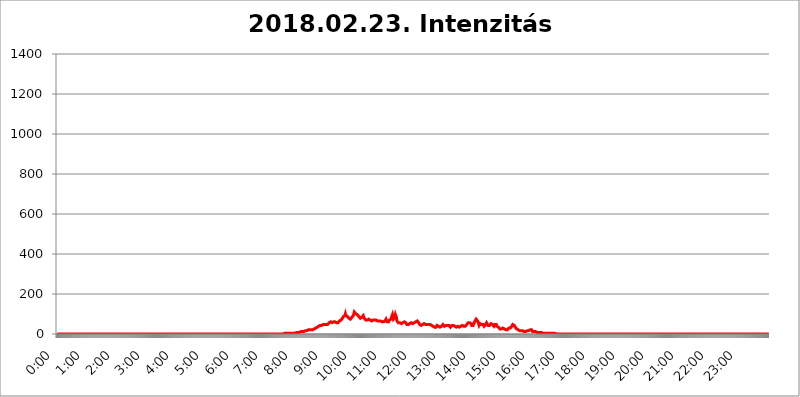
| Category | 2018.02.23. Intenzitás [W/m^2] |
|---|---|
| 0.0 | 0 |
| 0.0006944444444444445 | 0 |
| 0.001388888888888889 | 0 |
| 0.0020833333333333333 | 0 |
| 0.002777777777777778 | 0 |
| 0.003472222222222222 | 0 |
| 0.004166666666666667 | 0 |
| 0.004861111111111111 | 0 |
| 0.005555555555555556 | 0 |
| 0.0062499999999999995 | 0 |
| 0.006944444444444444 | 0 |
| 0.007638888888888889 | 0 |
| 0.008333333333333333 | 0 |
| 0.009027777777777779 | 0 |
| 0.009722222222222222 | 0 |
| 0.010416666666666666 | 0 |
| 0.011111111111111112 | 0 |
| 0.011805555555555555 | 0 |
| 0.012499999999999999 | 0 |
| 0.013194444444444444 | 0 |
| 0.013888888888888888 | 0 |
| 0.014583333333333332 | 0 |
| 0.015277777777777777 | 0 |
| 0.015972222222222224 | 0 |
| 0.016666666666666666 | 0 |
| 0.017361111111111112 | 0 |
| 0.018055555555555557 | 0 |
| 0.01875 | 0 |
| 0.019444444444444445 | 0 |
| 0.02013888888888889 | 0 |
| 0.020833333333333332 | 0 |
| 0.02152777777777778 | 0 |
| 0.022222222222222223 | 0 |
| 0.02291666666666667 | 0 |
| 0.02361111111111111 | 0 |
| 0.024305555555555556 | 0 |
| 0.024999999999999998 | 0 |
| 0.025694444444444447 | 0 |
| 0.02638888888888889 | 0 |
| 0.027083333333333334 | 0 |
| 0.027777777777777776 | 0 |
| 0.02847222222222222 | 0 |
| 0.029166666666666664 | 0 |
| 0.029861111111111113 | 0 |
| 0.030555555555555555 | 0 |
| 0.03125 | 0 |
| 0.03194444444444445 | 0 |
| 0.03263888888888889 | 0 |
| 0.03333333333333333 | 0 |
| 0.034027777777777775 | 0 |
| 0.034722222222222224 | 0 |
| 0.035416666666666666 | 0 |
| 0.036111111111111115 | 0 |
| 0.03680555555555556 | 0 |
| 0.0375 | 0 |
| 0.03819444444444444 | 0 |
| 0.03888888888888889 | 0 |
| 0.03958333333333333 | 0 |
| 0.04027777777777778 | 0 |
| 0.04097222222222222 | 0 |
| 0.041666666666666664 | 0 |
| 0.042361111111111106 | 0 |
| 0.04305555555555556 | 0 |
| 0.043750000000000004 | 0 |
| 0.044444444444444446 | 0 |
| 0.04513888888888889 | 0 |
| 0.04583333333333334 | 0 |
| 0.04652777777777778 | 0 |
| 0.04722222222222222 | 0 |
| 0.04791666666666666 | 0 |
| 0.04861111111111111 | 0 |
| 0.049305555555555554 | 0 |
| 0.049999999999999996 | 0 |
| 0.05069444444444445 | 0 |
| 0.051388888888888894 | 0 |
| 0.052083333333333336 | 0 |
| 0.05277777777777778 | 0 |
| 0.05347222222222222 | 0 |
| 0.05416666666666667 | 0 |
| 0.05486111111111111 | 0 |
| 0.05555555555555555 | 0 |
| 0.05625 | 0 |
| 0.05694444444444444 | 0 |
| 0.057638888888888885 | 0 |
| 0.05833333333333333 | 0 |
| 0.05902777777777778 | 0 |
| 0.059722222222222225 | 0 |
| 0.06041666666666667 | 0 |
| 0.061111111111111116 | 0 |
| 0.06180555555555556 | 0 |
| 0.0625 | 0 |
| 0.06319444444444444 | 0 |
| 0.06388888888888888 | 0 |
| 0.06458333333333334 | 0 |
| 0.06527777777777778 | 0 |
| 0.06597222222222222 | 0 |
| 0.06666666666666667 | 0 |
| 0.06736111111111111 | 0 |
| 0.06805555555555555 | 0 |
| 0.06874999999999999 | 0 |
| 0.06944444444444443 | 0 |
| 0.07013888888888889 | 0 |
| 0.07083333333333333 | 0 |
| 0.07152777777777779 | 0 |
| 0.07222222222222223 | 0 |
| 0.07291666666666667 | 0 |
| 0.07361111111111111 | 0 |
| 0.07430555555555556 | 0 |
| 0.075 | 0 |
| 0.07569444444444444 | 0 |
| 0.0763888888888889 | 0 |
| 0.07708333333333334 | 0 |
| 0.07777777777777778 | 0 |
| 0.07847222222222222 | 0 |
| 0.07916666666666666 | 0 |
| 0.0798611111111111 | 0 |
| 0.08055555555555556 | 0 |
| 0.08125 | 0 |
| 0.08194444444444444 | 0 |
| 0.08263888888888889 | 0 |
| 0.08333333333333333 | 0 |
| 0.08402777777777777 | 0 |
| 0.08472222222222221 | 0 |
| 0.08541666666666665 | 0 |
| 0.08611111111111112 | 0 |
| 0.08680555555555557 | 0 |
| 0.08750000000000001 | 0 |
| 0.08819444444444445 | 0 |
| 0.08888888888888889 | 0 |
| 0.08958333333333333 | 0 |
| 0.09027777777777778 | 0 |
| 0.09097222222222222 | 0 |
| 0.09166666666666667 | 0 |
| 0.09236111111111112 | 0 |
| 0.09305555555555556 | 0 |
| 0.09375 | 0 |
| 0.09444444444444444 | 0 |
| 0.09513888888888888 | 0 |
| 0.09583333333333333 | 0 |
| 0.09652777777777777 | 0 |
| 0.09722222222222222 | 0 |
| 0.09791666666666667 | 0 |
| 0.09861111111111111 | 0 |
| 0.09930555555555555 | 0 |
| 0.09999999999999999 | 0 |
| 0.10069444444444443 | 0 |
| 0.1013888888888889 | 0 |
| 0.10208333333333335 | 0 |
| 0.10277777777777779 | 0 |
| 0.10347222222222223 | 0 |
| 0.10416666666666667 | 0 |
| 0.10486111111111111 | 0 |
| 0.10555555555555556 | 0 |
| 0.10625 | 0 |
| 0.10694444444444444 | 0 |
| 0.1076388888888889 | 0 |
| 0.10833333333333334 | 0 |
| 0.10902777777777778 | 0 |
| 0.10972222222222222 | 0 |
| 0.1111111111111111 | 0 |
| 0.11180555555555556 | 0 |
| 0.11180555555555556 | 0 |
| 0.1125 | 0 |
| 0.11319444444444444 | 0 |
| 0.11388888888888889 | 0 |
| 0.11458333333333333 | 0 |
| 0.11527777777777777 | 0 |
| 0.11597222222222221 | 0 |
| 0.11666666666666665 | 0 |
| 0.1173611111111111 | 0 |
| 0.11805555555555557 | 0 |
| 0.11944444444444445 | 0 |
| 0.12013888888888889 | 0 |
| 0.12083333333333333 | 0 |
| 0.12152777777777778 | 0 |
| 0.12222222222222223 | 0 |
| 0.12291666666666667 | 0 |
| 0.12291666666666667 | 0 |
| 0.12361111111111112 | 0 |
| 0.12430555555555556 | 0 |
| 0.125 | 0 |
| 0.12569444444444444 | 0 |
| 0.12638888888888888 | 0 |
| 0.12708333333333333 | 0 |
| 0.16875 | 0 |
| 0.12847222222222224 | 0 |
| 0.12916666666666668 | 0 |
| 0.12986111111111112 | 0 |
| 0.13055555555555556 | 0 |
| 0.13125 | 0 |
| 0.13194444444444445 | 0 |
| 0.1326388888888889 | 0 |
| 0.13333333333333333 | 0 |
| 0.13402777777777777 | 0 |
| 0.13402777777777777 | 0 |
| 0.13472222222222222 | 0 |
| 0.13541666666666666 | 0 |
| 0.1361111111111111 | 0 |
| 0.13749999999999998 | 0 |
| 0.13819444444444443 | 0 |
| 0.1388888888888889 | 0 |
| 0.13958333333333334 | 0 |
| 0.14027777777777778 | 0 |
| 0.14097222222222222 | 0 |
| 0.14166666666666666 | 0 |
| 0.1423611111111111 | 0 |
| 0.14305555555555557 | 0 |
| 0.14375000000000002 | 0 |
| 0.14444444444444446 | 0 |
| 0.1451388888888889 | 0 |
| 0.1451388888888889 | 0 |
| 0.14652777777777778 | 0 |
| 0.14722222222222223 | 0 |
| 0.14791666666666667 | 0 |
| 0.1486111111111111 | 0 |
| 0.14930555555555555 | 0 |
| 0.15 | 0 |
| 0.15069444444444444 | 0 |
| 0.15138888888888888 | 0 |
| 0.15208333333333332 | 0 |
| 0.15277777777777776 | 0 |
| 0.15347222222222223 | 0 |
| 0.15416666666666667 | 0 |
| 0.15486111111111112 | 0 |
| 0.15555555555555556 | 0 |
| 0.15625 | 0 |
| 0.15694444444444444 | 0 |
| 0.15763888888888888 | 0 |
| 0.15833333333333333 | 0 |
| 0.15902777777777777 | 0 |
| 0.15972222222222224 | 0 |
| 0.16041666666666668 | 0 |
| 0.16111111111111112 | 0 |
| 0.16180555555555556 | 0 |
| 0.1625 | 0 |
| 0.16319444444444445 | 0 |
| 0.1638888888888889 | 0 |
| 0.16458333333333333 | 0 |
| 0.16527777777777777 | 0 |
| 0.16597222222222222 | 0 |
| 0.16666666666666666 | 0 |
| 0.1673611111111111 | 0 |
| 0.16805555555555554 | 0 |
| 0.16874999999999998 | 0 |
| 0.16944444444444443 | 0 |
| 0.17013888888888887 | 0 |
| 0.1708333333333333 | 0 |
| 0.17152777777777775 | 0 |
| 0.17222222222222225 | 0 |
| 0.1729166666666667 | 0 |
| 0.17361111111111113 | 0 |
| 0.17430555555555557 | 0 |
| 0.17500000000000002 | 0 |
| 0.17569444444444446 | 0 |
| 0.1763888888888889 | 0 |
| 0.17708333333333334 | 0 |
| 0.17777777777777778 | 0 |
| 0.17847222222222223 | 0 |
| 0.17916666666666667 | 0 |
| 0.1798611111111111 | 0 |
| 0.18055555555555555 | 0 |
| 0.18125 | 0 |
| 0.18194444444444444 | 0 |
| 0.1826388888888889 | 0 |
| 0.18333333333333335 | 0 |
| 0.1840277777777778 | 0 |
| 0.18472222222222223 | 0 |
| 0.18541666666666667 | 0 |
| 0.18611111111111112 | 0 |
| 0.18680555555555556 | 0 |
| 0.1875 | 0 |
| 0.18819444444444444 | 0 |
| 0.18888888888888888 | 0 |
| 0.18958333333333333 | 0 |
| 0.19027777777777777 | 0 |
| 0.1909722222222222 | 0 |
| 0.19166666666666665 | 0 |
| 0.19236111111111112 | 0 |
| 0.19305555555555554 | 0 |
| 0.19375 | 0 |
| 0.19444444444444445 | 0 |
| 0.1951388888888889 | 0 |
| 0.19583333333333333 | 0 |
| 0.19652777777777777 | 0 |
| 0.19722222222222222 | 0 |
| 0.19791666666666666 | 0 |
| 0.1986111111111111 | 0 |
| 0.19930555555555554 | 0 |
| 0.19999999999999998 | 0 |
| 0.20069444444444443 | 0 |
| 0.20138888888888887 | 0 |
| 0.2020833333333333 | 0 |
| 0.2027777777777778 | 0 |
| 0.2034722222222222 | 0 |
| 0.2041666666666667 | 0 |
| 0.20486111111111113 | 0 |
| 0.20555555555555557 | 0 |
| 0.20625000000000002 | 0 |
| 0.20694444444444446 | 0 |
| 0.2076388888888889 | 0 |
| 0.20833333333333334 | 0 |
| 0.20902777777777778 | 0 |
| 0.20972222222222223 | 0 |
| 0.21041666666666667 | 0 |
| 0.2111111111111111 | 0 |
| 0.21180555555555555 | 0 |
| 0.2125 | 0 |
| 0.21319444444444444 | 0 |
| 0.2138888888888889 | 0 |
| 0.21458333333333335 | 0 |
| 0.2152777777777778 | 0 |
| 0.21597222222222223 | 0 |
| 0.21666666666666667 | 0 |
| 0.21736111111111112 | 0 |
| 0.21805555555555556 | 0 |
| 0.21875 | 0 |
| 0.21944444444444444 | 0 |
| 0.22013888888888888 | 0 |
| 0.22083333333333333 | 0 |
| 0.22152777777777777 | 0 |
| 0.2222222222222222 | 0 |
| 0.22291666666666665 | 0 |
| 0.2236111111111111 | 0 |
| 0.22430555555555556 | 0 |
| 0.225 | 0 |
| 0.22569444444444445 | 0 |
| 0.2263888888888889 | 0 |
| 0.22708333333333333 | 0 |
| 0.22777777777777777 | 0 |
| 0.22847222222222222 | 0 |
| 0.22916666666666666 | 0 |
| 0.2298611111111111 | 0 |
| 0.23055555555555554 | 0 |
| 0.23124999999999998 | 0 |
| 0.23194444444444443 | 0 |
| 0.23263888888888887 | 0 |
| 0.2333333333333333 | 0 |
| 0.2340277777777778 | 0 |
| 0.2347222222222222 | 0 |
| 0.2354166666666667 | 0 |
| 0.23611111111111113 | 0 |
| 0.23680555555555557 | 0 |
| 0.23750000000000002 | 0 |
| 0.23819444444444446 | 0 |
| 0.2388888888888889 | 0 |
| 0.23958333333333334 | 0 |
| 0.24027777777777778 | 0 |
| 0.24097222222222223 | 0 |
| 0.24166666666666667 | 0 |
| 0.2423611111111111 | 0 |
| 0.24305555555555555 | 0 |
| 0.24375 | 0 |
| 0.24444444444444446 | 0 |
| 0.24513888888888888 | 0 |
| 0.24583333333333335 | 0 |
| 0.2465277777777778 | 0 |
| 0.24722222222222223 | 0 |
| 0.24791666666666667 | 0 |
| 0.24861111111111112 | 0 |
| 0.24930555555555556 | 0 |
| 0.25 | 0 |
| 0.25069444444444444 | 0 |
| 0.2513888888888889 | 0 |
| 0.2520833333333333 | 0 |
| 0.25277777777777777 | 0 |
| 0.2534722222222222 | 0 |
| 0.25416666666666665 | 0 |
| 0.2548611111111111 | 0 |
| 0.2555555555555556 | 0 |
| 0.25625000000000003 | 0 |
| 0.2569444444444445 | 0 |
| 0.2576388888888889 | 0 |
| 0.25833333333333336 | 0 |
| 0.2590277777777778 | 0 |
| 0.25972222222222224 | 0 |
| 0.2604166666666667 | 0 |
| 0.2611111111111111 | 0 |
| 0.26180555555555557 | 0 |
| 0.2625 | 0 |
| 0.26319444444444445 | 0 |
| 0.2638888888888889 | 0 |
| 0.26458333333333334 | 0 |
| 0.2652777777777778 | 0 |
| 0.2659722222222222 | 0 |
| 0.26666666666666666 | 0 |
| 0.2673611111111111 | 0 |
| 0.26805555555555555 | 0 |
| 0.26875 | 0 |
| 0.26944444444444443 | 0 |
| 0.2701388888888889 | 0 |
| 0.2708333333333333 | 0 |
| 0.27152777777777776 | 0 |
| 0.2722222222222222 | 0 |
| 0.27291666666666664 | 0 |
| 0.2736111111111111 | 0 |
| 0.2743055555555555 | 0 |
| 0.27499999999999997 | 0 |
| 0.27569444444444446 | 0 |
| 0.27638888888888885 | 0 |
| 0.27708333333333335 | 0 |
| 0.2777777777777778 | 0 |
| 0.27847222222222223 | 0 |
| 0.2791666666666667 | 0 |
| 0.2798611111111111 | 0 |
| 0.28055555555555556 | 0 |
| 0.28125 | 0 |
| 0.28194444444444444 | 0 |
| 0.2826388888888889 | 0 |
| 0.2833333333333333 | 0 |
| 0.28402777777777777 | 0 |
| 0.2847222222222222 | 0 |
| 0.28541666666666665 | 0 |
| 0.28611111111111115 | 0 |
| 0.28680555555555554 | 0 |
| 0.28750000000000003 | 0 |
| 0.2881944444444445 | 0 |
| 0.2888888888888889 | 0 |
| 0.28958333333333336 | 0 |
| 0.2902777777777778 | 0 |
| 0.29097222222222224 | 0 |
| 0.2916666666666667 | 0 |
| 0.2923611111111111 | 0 |
| 0.29305555555555557 | 0 |
| 0.29375 | 0 |
| 0.29444444444444445 | 0 |
| 0.2951388888888889 | 0 |
| 0.29583333333333334 | 0 |
| 0.2965277777777778 | 0 |
| 0.2972222222222222 | 0 |
| 0.29791666666666666 | 0 |
| 0.2986111111111111 | 0 |
| 0.29930555555555555 | 0 |
| 0.3 | 0 |
| 0.30069444444444443 | 0 |
| 0.3013888888888889 | 0 |
| 0.3020833333333333 | 0 |
| 0.30277777777777776 | 0 |
| 0.3034722222222222 | 0 |
| 0.30416666666666664 | 0 |
| 0.3048611111111111 | 0 |
| 0.3055555555555555 | 0 |
| 0.30624999999999997 | 0 |
| 0.3069444444444444 | 0 |
| 0.3076388888888889 | 0 |
| 0.30833333333333335 | 0 |
| 0.3090277777777778 | 0 |
| 0.30972222222222223 | 0 |
| 0.3104166666666667 | 0 |
| 0.3111111111111111 | 0 |
| 0.31180555555555556 | 0 |
| 0.3125 | 0 |
| 0.31319444444444444 | 0 |
| 0.3138888888888889 | 0 |
| 0.3145833333333333 | 0 |
| 0.31527777777777777 | 0 |
| 0.3159722222222222 | 0 |
| 0.31666666666666665 | 0 |
| 0.31736111111111115 | 3.525 |
| 0.31805555555555554 | 3.525 |
| 0.31875000000000003 | 3.525 |
| 0.3194444444444445 | 3.525 |
| 0.3201388888888889 | 3.525 |
| 0.32083333333333336 | 3.525 |
| 0.3215277777777778 | 3.525 |
| 0.32222222222222224 | 3.525 |
| 0.3229166666666667 | 3.525 |
| 0.3236111111111111 | 3.525 |
| 0.32430555555555557 | 3.525 |
| 0.325 | 3.525 |
| 0.32569444444444445 | 3.525 |
| 0.3263888888888889 | 3.525 |
| 0.32708333333333334 | 3.525 |
| 0.3277777777777778 | 3.525 |
| 0.3284722222222222 | 3.525 |
| 0.32916666666666666 | 3.525 |
| 0.3298611111111111 | 3.525 |
| 0.33055555555555555 | 3.525 |
| 0.33125 | 3.525 |
| 0.33194444444444443 | 3.525 |
| 0.3326388888888889 | 3.525 |
| 0.3333333333333333 | 3.525 |
| 0.3340277777777778 | 7.887 |
| 0.3347222222222222 | 7.887 |
| 0.3354166666666667 | 7.887 |
| 0.3361111111111111 | 7.887 |
| 0.3368055555555556 | 7.887 |
| 0.33749999999999997 | 7.887 |
| 0.33819444444444446 | 7.887 |
| 0.33888888888888885 | 7.887 |
| 0.33958333333333335 | 7.887 |
| 0.34027777777777773 | 7.887 |
| 0.34097222222222223 | 12.257 |
| 0.3416666666666666 | 12.257 |
| 0.3423611111111111 | 12.257 |
| 0.3430555555555555 | 12.257 |
| 0.34375 | 12.257 |
| 0.3444444444444445 | 12.257 |
| 0.3451388888888889 | 12.257 |
| 0.3458333333333334 | 12.257 |
| 0.34652777777777777 | 12.257 |
| 0.34722222222222227 | 12.257 |
| 0.34791666666666665 | 16.636 |
| 0.34861111111111115 | 12.257 |
| 0.34930555555555554 | 16.636 |
| 0.35000000000000003 | 16.636 |
| 0.3506944444444444 | 16.636 |
| 0.3513888888888889 | 16.636 |
| 0.3520833333333333 | 21.024 |
| 0.3527777777777778 | 21.024 |
| 0.3534722222222222 | 21.024 |
| 0.3541666666666667 | 21.024 |
| 0.3548611111111111 | 21.024 |
| 0.35555555555555557 | 25.419 |
| 0.35625 | 21.024 |
| 0.35694444444444445 | 21.024 |
| 0.3576388888888889 | 21.024 |
| 0.35833333333333334 | 21.024 |
| 0.3590277777777778 | 25.419 |
| 0.3597222222222222 | 25.419 |
| 0.36041666666666666 | 25.419 |
| 0.3611111111111111 | 29.823 |
| 0.36180555555555555 | 29.823 |
| 0.3625 | 29.823 |
| 0.36319444444444443 | 29.823 |
| 0.3638888888888889 | 34.234 |
| 0.3645833333333333 | 34.234 |
| 0.3652777777777778 | 38.653 |
| 0.3659722222222222 | 38.653 |
| 0.3666666666666667 | 38.653 |
| 0.3673611111111111 | 38.653 |
| 0.3680555555555556 | 38.653 |
| 0.36874999999999997 | 43.079 |
| 0.36944444444444446 | 43.079 |
| 0.37013888888888885 | 43.079 |
| 0.37083333333333335 | 43.079 |
| 0.37152777777777773 | 47.511 |
| 0.37222222222222223 | 47.511 |
| 0.3729166666666666 | 47.511 |
| 0.3736111111111111 | 47.511 |
| 0.3743055555555555 | 47.511 |
| 0.375 | 47.511 |
| 0.3756944444444445 | 51.951 |
| 0.3763888888888889 | 47.511 |
| 0.3770833333333334 | 47.511 |
| 0.37777777777777777 | 47.511 |
| 0.37847222222222227 | 47.511 |
| 0.37916666666666665 | 47.511 |
| 0.37986111111111115 | 47.511 |
| 0.38055555555555554 | 51.951 |
| 0.38125000000000003 | 56.398 |
| 0.3819444444444444 | 56.398 |
| 0.3826388888888889 | 60.85 |
| 0.3833333333333333 | 60.85 |
| 0.3840277777777778 | 56.398 |
| 0.3847222222222222 | 56.398 |
| 0.3854166666666667 | 56.398 |
| 0.3861111111111111 | 56.398 |
| 0.38680555555555557 | 56.398 |
| 0.3875 | 60.85 |
| 0.38819444444444445 | 60.85 |
| 0.3888888888888889 | 56.398 |
| 0.38958333333333334 | 60.85 |
| 0.3902777777777778 | 56.398 |
| 0.3909722222222222 | 56.398 |
| 0.39166666666666666 | 56.398 |
| 0.3923611111111111 | 56.398 |
| 0.39305555555555555 | 51.951 |
| 0.39375 | 56.398 |
| 0.39444444444444443 | 56.398 |
| 0.3951388888888889 | 60.85 |
| 0.3958333333333333 | 65.31 |
| 0.3965277777777778 | 65.31 |
| 0.3972222222222222 | 65.31 |
| 0.3979166666666667 | 69.775 |
| 0.3986111111111111 | 69.775 |
| 0.3993055555555556 | 74.246 |
| 0.39999999999999997 | 78.722 |
| 0.40069444444444446 | 83.205 |
| 0.40138888888888885 | 87.692 |
| 0.40208333333333335 | 87.692 |
| 0.40277777777777773 | 87.692 |
| 0.40347222222222223 | 92.184 |
| 0.4041666666666666 | 101.184 |
| 0.4048611111111111 | 92.184 |
| 0.4055555555555555 | 92.184 |
| 0.40625 | 92.184 |
| 0.4069444444444445 | 87.692 |
| 0.4076388888888889 | 83.205 |
| 0.4083333333333334 | 83.205 |
| 0.40902777777777777 | 78.722 |
| 0.40972222222222227 | 74.246 |
| 0.41041666666666665 | 74.246 |
| 0.41111111111111115 | 74.246 |
| 0.41180555555555554 | 74.246 |
| 0.41250000000000003 | 78.722 |
| 0.4131944444444444 | 83.205 |
| 0.4138888888888889 | 87.692 |
| 0.4145833333333333 | 87.692 |
| 0.4152777777777778 | 92.184 |
| 0.4159722222222222 | 101.184 |
| 0.4166666666666667 | 110.201 |
| 0.4173611111111111 | 105.69 |
| 0.41805555555555557 | 110.201 |
| 0.41875 | 101.184 |
| 0.41944444444444445 | 96.682 |
| 0.4201388888888889 | 101.184 |
| 0.42083333333333334 | 96.682 |
| 0.4215277777777778 | 92.184 |
| 0.4222222222222222 | 96.682 |
| 0.42291666666666666 | 87.692 |
| 0.4236111111111111 | 83.205 |
| 0.42430555555555555 | 83.205 |
| 0.425 | 78.722 |
| 0.42569444444444443 | 78.722 |
| 0.4263888888888889 | 83.205 |
| 0.4270833333333333 | 83.205 |
| 0.4277777777777778 | 83.205 |
| 0.4284722222222222 | 83.205 |
| 0.4291666666666667 | 92.184 |
| 0.4298611111111111 | 87.692 |
| 0.4305555555555556 | 78.722 |
| 0.43124999999999997 | 78.722 |
| 0.43194444444444446 | 74.246 |
| 0.43263888888888885 | 69.775 |
| 0.43333333333333335 | 74.246 |
| 0.43402777777777773 | 74.246 |
| 0.43472222222222223 | 69.775 |
| 0.4354166666666666 | 69.775 |
| 0.4361111111111111 | 74.246 |
| 0.4368055555555555 | 74.246 |
| 0.4375 | 74.246 |
| 0.4381944444444445 | 74.246 |
| 0.4388888888888889 | 69.775 |
| 0.4395833333333334 | 65.31 |
| 0.44027777777777777 | 65.31 |
| 0.44097222222222227 | 65.31 |
| 0.44166666666666665 | 65.31 |
| 0.44236111111111115 | 69.775 |
| 0.44305555555555554 | 69.775 |
| 0.44375000000000003 | 69.775 |
| 0.4444444444444444 | 65.31 |
| 0.4451388888888889 | 69.775 |
| 0.4458333333333333 | 74.246 |
| 0.4465277777777778 | 74.246 |
| 0.4472222222222222 | 69.775 |
| 0.4479166666666667 | 69.775 |
| 0.4486111111111111 | 69.775 |
| 0.44930555555555557 | 65.31 |
| 0.45 | 65.31 |
| 0.45069444444444445 | 65.31 |
| 0.4513888888888889 | 65.31 |
| 0.45208333333333334 | 65.31 |
| 0.4527777777777778 | 65.31 |
| 0.4534722222222222 | 65.31 |
| 0.45416666666666666 | 60.85 |
| 0.4548611111111111 | 60.85 |
| 0.45555555555555555 | 60.85 |
| 0.45625 | 60.85 |
| 0.45694444444444443 | 60.85 |
| 0.4576388888888889 | 60.85 |
| 0.4583333333333333 | 60.85 |
| 0.4590277777777778 | 60.85 |
| 0.4597222222222222 | 65.31 |
| 0.4604166666666667 | 69.775 |
| 0.4611111111111111 | 74.246 |
| 0.4618055555555556 | 69.775 |
| 0.46249999999999997 | 60.85 |
| 0.46319444444444446 | 60.85 |
| 0.46388888888888885 | 56.398 |
| 0.46458333333333335 | 60.85 |
| 0.46527777777777773 | 65.31 |
| 0.46597222222222223 | 69.775 |
| 0.4666666666666666 | 69.775 |
| 0.4673611111111111 | 74.246 |
| 0.4680555555555555 | 74.246 |
| 0.46875 | 83.205 |
| 0.4694444444444445 | 87.692 |
| 0.4701388888888889 | 96.682 |
| 0.4708333333333334 | 96.682 |
| 0.47152777777777777 | 74.246 |
| 0.47222222222222227 | 69.775 |
| 0.47291666666666665 | 78.722 |
| 0.47361111111111115 | 83.205 |
| 0.47430555555555554 | 96.682 |
| 0.47500000000000003 | 92.184 |
| 0.4756944444444444 | 83.205 |
| 0.4763888888888889 | 65.31 |
| 0.4770833333333333 | 60.85 |
| 0.4777777777777778 | 60.85 |
| 0.4784722222222222 | 56.398 |
| 0.4791666666666667 | 56.398 |
| 0.4798611111111111 | 56.398 |
| 0.48055555555555557 | 56.398 |
| 0.48125 | 56.398 |
| 0.48194444444444445 | 51.951 |
| 0.4826388888888889 | 51.951 |
| 0.48333333333333334 | 56.398 |
| 0.4840277777777778 | 56.398 |
| 0.4847222222222222 | 56.398 |
| 0.48541666666666666 | 56.398 |
| 0.4861111111111111 | 56.398 |
| 0.48680555555555555 | 60.85 |
| 0.4875 | 60.85 |
| 0.48819444444444443 | 56.398 |
| 0.4888888888888889 | 56.398 |
| 0.4895833333333333 | 51.951 |
| 0.4902777777777778 | 47.511 |
| 0.4909722222222222 | 47.511 |
| 0.4916666666666667 | 47.511 |
| 0.4923611111111111 | 47.511 |
| 0.4930555555555556 | 47.511 |
| 0.49374999999999997 | 47.511 |
| 0.49444444444444446 | 51.951 |
| 0.49513888888888885 | 51.951 |
| 0.49583333333333335 | 56.398 |
| 0.49652777777777773 | 56.398 |
| 0.49722222222222223 | 56.398 |
| 0.4979166666666666 | 56.398 |
| 0.4986111111111111 | 51.951 |
| 0.4993055555555555 | 56.398 |
| 0.5 | 56.398 |
| 0.5006944444444444 | 56.398 |
| 0.5013888888888889 | 56.398 |
| 0.5020833333333333 | 56.398 |
| 0.5027777777777778 | 60.85 |
| 0.5034722222222222 | 65.31 |
| 0.5041666666666667 | 65.31 |
| 0.5048611111111111 | 65.31 |
| 0.5055555555555555 | 65.31 |
| 0.50625 | 60.85 |
| 0.5069444444444444 | 56.398 |
| 0.5076388888888889 | 51.951 |
| 0.5083333333333333 | 47.511 |
| 0.5090277777777777 | 47.511 |
| 0.5097222222222222 | 47.511 |
| 0.5104166666666666 | 43.079 |
| 0.5111111111111112 | 43.079 |
| 0.5118055555555555 | 47.511 |
| 0.5125000000000001 | 47.511 |
| 0.5131944444444444 | 51.951 |
| 0.513888888888889 | 51.951 |
| 0.5145833333333333 | 51.951 |
| 0.5152777777777778 | 51.951 |
| 0.5159722222222222 | 51.951 |
| 0.5166666666666667 | 47.511 |
| 0.517361111111111 | 47.511 |
| 0.5180555555555556 | 47.511 |
| 0.5187499999999999 | 47.511 |
| 0.5194444444444445 | 47.511 |
| 0.5201388888888888 | 47.511 |
| 0.5208333333333334 | 47.511 |
| 0.5215277777777778 | 47.511 |
| 0.5222222222222223 | 43.079 |
| 0.5229166666666667 | 47.511 |
| 0.5236111111111111 | 47.511 |
| 0.5243055555555556 | 47.511 |
| 0.525 | 43.079 |
| 0.5256944444444445 | 43.079 |
| 0.5263888888888889 | 43.079 |
| 0.5270833333333333 | 38.653 |
| 0.5277777777777778 | 38.653 |
| 0.5284722222222222 | 34.234 |
| 0.5291666666666667 | 34.234 |
| 0.5298611111111111 | 34.234 |
| 0.5305555555555556 | 34.234 |
| 0.53125 | 34.234 |
| 0.5319444444444444 | 38.653 |
| 0.5326388888888889 | 43.079 |
| 0.5333333333333333 | 47.511 |
| 0.5340277777777778 | 43.079 |
| 0.5347222222222222 | 38.653 |
| 0.5354166666666667 | 34.234 |
| 0.5361111111111111 | 34.234 |
| 0.5368055555555555 | 34.234 |
| 0.5375 | 38.653 |
| 0.5381944444444444 | 38.653 |
| 0.5388888888888889 | 38.653 |
| 0.5395833333333333 | 38.653 |
| 0.5402777777777777 | 43.079 |
| 0.5409722222222222 | 47.511 |
| 0.5416666666666666 | 47.511 |
| 0.5423611111111112 | 43.079 |
| 0.5430555555555555 | 38.653 |
| 0.5437500000000001 | 38.653 |
| 0.5444444444444444 | 38.653 |
| 0.545138888888889 | 43.079 |
| 0.5458333333333333 | 47.511 |
| 0.5465277777777778 | 47.511 |
| 0.5472222222222222 | 43.079 |
| 0.5479166666666667 | 43.079 |
| 0.548611111111111 | 43.079 |
| 0.5493055555555556 | 43.079 |
| 0.5499999999999999 | 43.079 |
| 0.5506944444444445 | 38.653 |
| 0.5513888888888888 | 34.234 |
| 0.5520833333333334 | 34.234 |
| 0.5527777777777778 | 38.653 |
| 0.5534722222222223 | 43.079 |
| 0.5541666666666667 | 47.511 |
| 0.5548611111111111 | 47.511 |
| 0.5555555555555556 | 43.079 |
| 0.55625 | 38.653 |
| 0.5569444444444445 | 38.653 |
| 0.5576388888888889 | 38.653 |
| 0.5583333333333333 | 38.653 |
| 0.5590277777777778 | 38.653 |
| 0.5597222222222222 | 34.234 |
| 0.5604166666666667 | 38.653 |
| 0.5611111111111111 | 38.653 |
| 0.5618055555555556 | 38.653 |
| 0.5625 | 38.653 |
| 0.5631944444444444 | 34.234 |
| 0.5638888888888889 | 34.234 |
| 0.5645833333333333 | 38.653 |
| 0.5652777777777778 | 38.653 |
| 0.5659722222222222 | 38.653 |
| 0.5666666666666667 | 43.079 |
| 0.5673611111111111 | 43.079 |
| 0.5680555555555555 | 43.079 |
| 0.56875 | 43.079 |
| 0.5694444444444444 | 43.079 |
| 0.5701388888888889 | 38.653 |
| 0.5708333333333333 | 34.234 |
| 0.5715277777777777 | 34.234 |
| 0.5722222222222222 | 38.653 |
| 0.5729166666666666 | 38.653 |
| 0.5736111111111112 | 43.079 |
| 0.5743055555555555 | 47.511 |
| 0.5750000000000001 | 51.951 |
| 0.5756944444444444 | 51.951 |
| 0.576388888888889 | 56.398 |
| 0.5770833333333333 | 56.398 |
| 0.5777777777777778 | 60.85 |
| 0.5784722222222222 | 56.398 |
| 0.5791666666666667 | 56.398 |
| 0.579861111111111 | 56.398 |
| 0.5805555555555556 | 51.951 |
| 0.5812499999999999 | 43.079 |
| 0.5819444444444445 | 43.079 |
| 0.5826388888888888 | 38.653 |
| 0.5833333333333334 | 43.079 |
| 0.5840277777777778 | 47.511 |
| 0.5847222222222223 | 56.398 |
| 0.5854166666666667 | 56.398 |
| 0.5861111111111111 | 65.31 |
| 0.5868055555555556 | 69.775 |
| 0.5875 | 74.246 |
| 0.5881944444444445 | 69.775 |
| 0.5888888888888889 | 69.775 |
| 0.5895833333333333 | 65.31 |
| 0.5902777777777778 | 60.85 |
| 0.5909722222222222 | 51.951 |
| 0.5916666666666667 | 43.079 |
| 0.5923611111111111 | 43.079 |
| 0.5930555555555556 | 51.951 |
| 0.59375 | 56.398 |
| 0.5944444444444444 | 56.398 |
| 0.5951388888888889 | 47.511 |
| 0.5958333333333333 | 43.079 |
| 0.5965277777777778 | 43.079 |
| 0.5972222222222222 | 47.511 |
| 0.5979166666666667 | 43.079 |
| 0.5986111111111111 | 38.653 |
| 0.5993055555555555 | 38.653 |
| 0.6 | 43.079 |
| 0.6006944444444444 | 47.511 |
| 0.6013888888888889 | 47.511 |
| 0.6020833333333333 | 56.398 |
| 0.6027777777777777 | 60.85 |
| 0.6034722222222222 | 51.951 |
| 0.6041666666666666 | 43.079 |
| 0.6048611111111112 | 43.079 |
| 0.6055555555555555 | 43.079 |
| 0.6062500000000001 | 43.079 |
| 0.6069444444444444 | 47.511 |
| 0.607638888888889 | 47.511 |
| 0.6083333333333333 | 51.951 |
| 0.6090277777777778 | 56.398 |
| 0.6097222222222222 | 51.951 |
| 0.6104166666666667 | 47.511 |
| 0.611111111111111 | 47.511 |
| 0.6118055555555556 | 43.079 |
| 0.6124999999999999 | 38.653 |
| 0.6131944444444445 | 38.653 |
| 0.6138888888888888 | 47.511 |
| 0.6145833333333334 | 47.511 |
| 0.6152777777777778 | 47.511 |
| 0.6159722222222223 | 47.511 |
| 0.6166666666666667 | 38.653 |
| 0.6173611111111111 | 34.234 |
| 0.6180555555555556 | 34.234 |
| 0.61875 | 34.234 |
| 0.6194444444444445 | 34.234 |
| 0.6201388888888889 | 29.823 |
| 0.6208333333333333 | 25.419 |
| 0.6215277777777778 | 25.419 |
| 0.6222222222222222 | 29.823 |
| 0.6229166666666667 | 25.419 |
| 0.6236111111111111 | 29.823 |
| 0.6243055555555556 | 29.823 |
| 0.625 | 29.823 |
| 0.6256944444444444 | 29.823 |
| 0.6263888888888889 | 25.419 |
| 0.6270833333333333 | 25.419 |
| 0.6277777777777778 | 21.024 |
| 0.6284722222222222 | 21.024 |
| 0.6291666666666667 | 21.024 |
| 0.6298611111111111 | 21.024 |
| 0.6305555555555555 | 21.024 |
| 0.63125 | 21.024 |
| 0.6319444444444444 | 25.419 |
| 0.6326388888888889 | 25.419 |
| 0.6333333333333333 | 29.823 |
| 0.6340277777777777 | 29.823 |
| 0.6347222222222222 | 29.823 |
| 0.6354166666666666 | 29.823 |
| 0.6361111111111112 | 34.234 |
| 0.6368055555555555 | 34.234 |
| 0.6375000000000001 | 38.653 |
| 0.6381944444444444 | 43.079 |
| 0.638888888888889 | 47.511 |
| 0.6395833333333333 | 47.511 |
| 0.6402777777777778 | 47.511 |
| 0.6409722222222222 | 43.079 |
| 0.6416666666666667 | 38.653 |
| 0.642361111111111 | 34.234 |
| 0.6430555555555556 | 34.234 |
| 0.6437499999999999 | 29.823 |
| 0.6444444444444445 | 25.419 |
| 0.6451388888888888 | 25.419 |
| 0.6458333333333334 | 21.024 |
| 0.6465277777777778 | 21.024 |
| 0.6472222222222223 | 16.636 |
| 0.6479166666666667 | 16.636 |
| 0.6486111111111111 | 16.636 |
| 0.6493055555555556 | 16.636 |
| 0.65 | 16.636 |
| 0.6506944444444445 | 16.636 |
| 0.6513888888888889 | 16.636 |
| 0.6520833333333333 | 16.636 |
| 0.6527777777777778 | 16.636 |
| 0.6534722222222222 | 12.257 |
| 0.6541666666666667 | 12.257 |
| 0.6548611111111111 | 12.257 |
| 0.6555555555555556 | 12.257 |
| 0.65625 | 12.257 |
| 0.6569444444444444 | 12.257 |
| 0.6576388888888889 | 16.636 |
| 0.6583333333333333 | 16.636 |
| 0.6590277777777778 | 16.636 |
| 0.6597222222222222 | 16.636 |
| 0.6604166666666667 | 12.257 |
| 0.6611111111111111 | 16.636 |
| 0.6618055555555555 | 21.024 |
| 0.6625 | 21.024 |
| 0.6631944444444444 | 21.024 |
| 0.6638888888888889 | 21.024 |
| 0.6645833333333333 | 21.024 |
| 0.6652777777777777 | 21.024 |
| 0.6659722222222222 | 16.636 |
| 0.6666666666666666 | 12.257 |
| 0.6673611111111111 | 12.257 |
| 0.6680555555555556 | 12.257 |
| 0.6687500000000001 | 12.257 |
| 0.6694444444444444 | 12.257 |
| 0.6701388888888888 | 12.257 |
| 0.6708333333333334 | 12.257 |
| 0.6715277777777778 | 7.887 |
| 0.6722222222222222 | 7.887 |
| 0.6729166666666666 | 7.887 |
| 0.6736111111111112 | 7.887 |
| 0.6743055555555556 | 7.887 |
| 0.6749999999999999 | 7.887 |
| 0.6756944444444444 | 7.887 |
| 0.6763888888888889 | 7.887 |
| 0.6770833333333334 | 7.887 |
| 0.6777777777777777 | 7.887 |
| 0.6784722222222223 | 7.887 |
| 0.6791666666666667 | 7.887 |
| 0.6798611111111111 | 3.525 |
| 0.6805555555555555 | 3.525 |
| 0.68125 | 3.525 |
| 0.6819444444444445 | 3.525 |
| 0.6826388888888889 | 3.525 |
| 0.6833333333333332 | 3.525 |
| 0.6840277777777778 | 3.525 |
| 0.6847222222222222 | 3.525 |
| 0.6854166666666667 | 3.525 |
| 0.686111111111111 | 3.525 |
| 0.6868055555555556 | 3.525 |
| 0.6875 | 3.525 |
| 0.6881944444444444 | 3.525 |
| 0.688888888888889 | 3.525 |
| 0.6895833333333333 | 3.525 |
| 0.6902777777777778 | 3.525 |
| 0.6909722222222222 | 3.525 |
| 0.6916666666666668 | 3.525 |
| 0.6923611111111111 | 3.525 |
| 0.6930555555555555 | 3.525 |
| 0.69375 | 3.525 |
| 0.6944444444444445 | 3.525 |
| 0.6951388888888889 | 3.525 |
| 0.6958333333333333 | 3.525 |
| 0.6965277777777777 | 3.525 |
| 0.6972222222222223 | 3.525 |
| 0.6979166666666666 | 3.525 |
| 0.6986111111111111 | 0 |
| 0.6993055555555556 | 0 |
| 0.7000000000000001 | 0 |
| 0.7006944444444444 | 0 |
| 0.7013888888888888 | 0 |
| 0.7020833333333334 | 0 |
| 0.7027777777777778 | 0 |
| 0.7034722222222222 | 0 |
| 0.7041666666666666 | 0 |
| 0.7048611111111112 | 0 |
| 0.7055555555555556 | 0 |
| 0.7062499999999999 | 0 |
| 0.7069444444444444 | 0 |
| 0.7076388888888889 | 0 |
| 0.7083333333333334 | 0 |
| 0.7090277777777777 | 0 |
| 0.7097222222222223 | 0 |
| 0.7104166666666667 | 0 |
| 0.7111111111111111 | 0 |
| 0.7118055555555555 | 0 |
| 0.7125 | 0 |
| 0.7131944444444445 | 0 |
| 0.7138888888888889 | 0 |
| 0.7145833333333332 | 0 |
| 0.7152777777777778 | 0 |
| 0.7159722222222222 | 0 |
| 0.7166666666666667 | 0 |
| 0.717361111111111 | 0 |
| 0.7180555555555556 | 0 |
| 0.71875 | 0 |
| 0.7194444444444444 | 0 |
| 0.720138888888889 | 0 |
| 0.7208333333333333 | 0 |
| 0.7215277777777778 | 0 |
| 0.7222222222222222 | 0 |
| 0.7229166666666668 | 0 |
| 0.7236111111111111 | 0 |
| 0.7243055555555555 | 0 |
| 0.725 | 0 |
| 0.7256944444444445 | 0 |
| 0.7263888888888889 | 0 |
| 0.7270833333333333 | 0 |
| 0.7277777777777777 | 0 |
| 0.7284722222222223 | 0 |
| 0.7291666666666666 | 0 |
| 0.7298611111111111 | 0 |
| 0.7305555555555556 | 0 |
| 0.7312500000000001 | 0 |
| 0.7319444444444444 | 0 |
| 0.7326388888888888 | 0 |
| 0.7333333333333334 | 0 |
| 0.7340277777777778 | 0 |
| 0.7347222222222222 | 0 |
| 0.7354166666666666 | 0 |
| 0.7361111111111112 | 0 |
| 0.7368055555555556 | 0 |
| 0.7374999999999999 | 0 |
| 0.7381944444444444 | 0 |
| 0.7388888888888889 | 0 |
| 0.7395833333333334 | 0 |
| 0.7402777777777777 | 0 |
| 0.7409722222222223 | 0 |
| 0.7416666666666667 | 0 |
| 0.7423611111111111 | 0 |
| 0.7430555555555555 | 0 |
| 0.74375 | 0 |
| 0.7444444444444445 | 0 |
| 0.7451388888888889 | 0 |
| 0.7458333333333332 | 0 |
| 0.7465277777777778 | 0 |
| 0.7472222222222222 | 0 |
| 0.7479166666666667 | 0 |
| 0.748611111111111 | 0 |
| 0.7493055555555556 | 0 |
| 0.75 | 0 |
| 0.7506944444444444 | 0 |
| 0.751388888888889 | 0 |
| 0.7520833333333333 | 0 |
| 0.7527777777777778 | 0 |
| 0.7534722222222222 | 0 |
| 0.7541666666666668 | 0 |
| 0.7548611111111111 | 0 |
| 0.7555555555555555 | 0 |
| 0.75625 | 0 |
| 0.7569444444444445 | 0 |
| 0.7576388888888889 | 0 |
| 0.7583333333333333 | 0 |
| 0.7590277777777777 | 0 |
| 0.7597222222222223 | 0 |
| 0.7604166666666666 | 0 |
| 0.7611111111111111 | 0 |
| 0.7618055555555556 | 0 |
| 0.7625000000000001 | 0 |
| 0.7631944444444444 | 0 |
| 0.7638888888888888 | 0 |
| 0.7645833333333334 | 0 |
| 0.7652777777777778 | 0 |
| 0.7659722222222222 | 0 |
| 0.7666666666666666 | 0 |
| 0.7673611111111112 | 0 |
| 0.7680555555555556 | 0 |
| 0.7687499999999999 | 0 |
| 0.7694444444444444 | 0 |
| 0.7701388888888889 | 0 |
| 0.7708333333333334 | 0 |
| 0.7715277777777777 | 0 |
| 0.7722222222222223 | 0 |
| 0.7729166666666667 | 0 |
| 0.7736111111111111 | 0 |
| 0.7743055555555555 | 0 |
| 0.775 | 0 |
| 0.7756944444444445 | 0 |
| 0.7763888888888889 | 0 |
| 0.7770833333333332 | 0 |
| 0.7777777777777778 | 0 |
| 0.7784722222222222 | 0 |
| 0.7791666666666667 | 0 |
| 0.779861111111111 | 0 |
| 0.7805555555555556 | 0 |
| 0.78125 | 0 |
| 0.7819444444444444 | 0 |
| 0.782638888888889 | 0 |
| 0.7833333333333333 | 0 |
| 0.7840277777777778 | 0 |
| 0.7847222222222222 | 0 |
| 0.7854166666666668 | 0 |
| 0.7861111111111111 | 0 |
| 0.7868055555555555 | 0 |
| 0.7875 | 0 |
| 0.7881944444444445 | 0 |
| 0.7888888888888889 | 0 |
| 0.7895833333333333 | 0 |
| 0.7902777777777777 | 0 |
| 0.7909722222222223 | 0 |
| 0.7916666666666666 | 0 |
| 0.7923611111111111 | 0 |
| 0.7930555555555556 | 0 |
| 0.7937500000000001 | 0 |
| 0.7944444444444444 | 0 |
| 0.7951388888888888 | 0 |
| 0.7958333333333334 | 0 |
| 0.7965277777777778 | 0 |
| 0.7972222222222222 | 0 |
| 0.7979166666666666 | 0 |
| 0.7986111111111112 | 0 |
| 0.7993055555555556 | 0 |
| 0.7999999999999999 | 0 |
| 0.8006944444444444 | 0 |
| 0.8013888888888889 | 0 |
| 0.8020833333333334 | 0 |
| 0.8027777777777777 | 0 |
| 0.8034722222222223 | 0 |
| 0.8041666666666667 | 0 |
| 0.8048611111111111 | 0 |
| 0.8055555555555555 | 0 |
| 0.80625 | 0 |
| 0.8069444444444445 | 0 |
| 0.8076388888888889 | 0 |
| 0.8083333333333332 | 0 |
| 0.8090277777777778 | 0 |
| 0.8097222222222222 | 0 |
| 0.8104166666666667 | 0 |
| 0.811111111111111 | 0 |
| 0.8118055555555556 | 0 |
| 0.8125 | 0 |
| 0.8131944444444444 | 0 |
| 0.813888888888889 | 0 |
| 0.8145833333333333 | 0 |
| 0.8152777777777778 | 0 |
| 0.8159722222222222 | 0 |
| 0.8166666666666668 | 0 |
| 0.8173611111111111 | 0 |
| 0.8180555555555555 | 0 |
| 0.81875 | 0 |
| 0.8194444444444445 | 0 |
| 0.8201388888888889 | 0 |
| 0.8208333333333333 | 0 |
| 0.8215277777777777 | 0 |
| 0.8222222222222223 | 0 |
| 0.8229166666666666 | 0 |
| 0.8236111111111111 | 0 |
| 0.8243055555555556 | 0 |
| 0.8250000000000001 | 0 |
| 0.8256944444444444 | 0 |
| 0.8263888888888888 | 0 |
| 0.8270833333333334 | 0 |
| 0.8277777777777778 | 0 |
| 0.8284722222222222 | 0 |
| 0.8291666666666666 | 0 |
| 0.8298611111111112 | 0 |
| 0.8305555555555556 | 0 |
| 0.8312499999999999 | 0 |
| 0.8319444444444444 | 0 |
| 0.8326388888888889 | 0 |
| 0.8333333333333334 | 0 |
| 0.8340277777777777 | 0 |
| 0.8347222222222223 | 0 |
| 0.8354166666666667 | 0 |
| 0.8361111111111111 | 0 |
| 0.8368055555555555 | 0 |
| 0.8375 | 0 |
| 0.8381944444444445 | 0 |
| 0.8388888888888889 | 0 |
| 0.8395833333333332 | 0 |
| 0.8402777777777778 | 0 |
| 0.8409722222222222 | 0 |
| 0.8416666666666667 | 0 |
| 0.842361111111111 | 0 |
| 0.8430555555555556 | 0 |
| 0.84375 | 0 |
| 0.8444444444444444 | 0 |
| 0.845138888888889 | 0 |
| 0.8458333333333333 | 0 |
| 0.8465277777777778 | 0 |
| 0.8472222222222222 | 0 |
| 0.8479166666666668 | 0 |
| 0.8486111111111111 | 0 |
| 0.8493055555555555 | 0 |
| 0.85 | 0 |
| 0.8506944444444445 | 0 |
| 0.8513888888888889 | 0 |
| 0.8520833333333333 | 0 |
| 0.8527777777777777 | 0 |
| 0.8534722222222223 | 0 |
| 0.8541666666666666 | 0 |
| 0.8548611111111111 | 0 |
| 0.8555555555555556 | 0 |
| 0.8562500000000001 | 0 |
| 0.8569444444444444 | 0 |
| 0.8576388888888888 | 0 |
| 0.8583333333333334 | 0 |
| 0.8590277777777778 | 0 |
| 0.8597222222222222 | 0 |
| 0.8604166666666666 | 0 |
| 0.8611111111111112 | 0 |
| 0.8618055555555556 | 0 |
| 0.8624999999999999 | 0 |
| 0.8631944444444444 | 0 |
| 0.8638888888888889 | 0 |
| 0.8645833333333334 | 0 |
| 0.8652777777777777 | 0 |
| 0.8659722222222223 | 0 |
| 0.8666666666666667 | 0 |
| 0.8673611111111111 | 0 |
| 0.8680555555555555 | 0 |
| 0.86875 | 0 |
| 0.8694444444444445 | 0 |
| 0.8701388888888889 | 0 |
| 0.8708333333333332 | 0 |
| 0.8715277777777778 | 0 |
| 0.8722222222222222 | 0 |
| 0.8729166666666667 | 0 |
| 0.873611111111111 | 0 |
| 0.8743055555555556 | 0 |
| 0.875 | 0 |
| 0.8756944444444444 | 0 |
| 0.876388888888889 | 0 |
| 0.8770833333333333 | 0 |
| 0.8777777777777778 | 0 |
| 0.8784722222222222 | 0 |
| 0.8791666666666668 | 0 |
| 0.8798611111111111 | 0 |
| 0.8805555555555555 | 0 |
| 0.88125 | 0 |
| 0.8819444444444445 | 0 |
| 0.8826388888888889 | 0 |
| 0.8833333333333333 | 0 |
| 0.8840277777777777 | 0 |
| 0.8847222222222223 | 0 |
| 0.8854166666666666 | 0 |
| 0.8861111111111111 | 0 |
| 0.8868055555555556 | 0 |
| 0.8875000000000001 | 0 |
| 0.8881944444444444 | 0 |
| 0.8888888888888888 | 0 |
| 0.8895833333333334 | 0 |
| 0.8902777777777778 | 0 |
| 0.8909722222222222 | 0 |
| 0.8916666666666666 | 0 |
| 0.8923611111111112 | 0 |
| 0.8930555555555556 | 0 |
| 0.8937499999999999 | 0 |
| 0.8944444444444444 | 0 |
| 0.8951388888888889 | 0 |
| 0.8958333333333334 | 0 |
| 0.8965277777777777 | 0 |
| 0.8972222222222223 | 0 |
| 0.8979166666666667 | 0 |
| 0.8986111111111111 | 0 |
| 0.8993055555555555 | 0 |
| 0.9 | 0 |
| 0.9006944444444445 | 0 |
| 0.9013888888888889 | 0 |
| 0.9020833333333332 | 0 |
| 0.9027777777777778 | 0 |
| 0.9034722222222222 | 0 |
| 0.9041666666666667 | 0 |
| 0.904861111111111 | 0 |
| 0.9055555555555556 | 0 |
| 0.90625 | 0 |
| 0.9069444444444444 | 0 |
| 0.907638888888889 | 0 |
| 0.9083333333333333 | 0 |
| 0.9090277777777778 | 0 |
| 0.9097222222222222 | 0 |
| 0.9104166666666668 | 0 |
| 0.9111111111111111 | 0 |
| 0.9118055555555555 | 0 |
| 0.9125 | 0 |
| 0.9131944444444445 | 0 |
| 0.9138888888888889 | 0 |
| 0.9145833333333333 | 0 |
| 0.9152777777777777 | 0 |
| 0.9159722222222223 | 0 |
| 0.9166666666666666 | 0 |
| 0.9173611111111111 | 0 |
| 0.9180555555555556 | 0 |
| 0.9187500000000001 | 0 |
| 0.9194444444444444 | 0 |
| 0.9201388888888888 | 0 |
| 0.9208333333333334 | 0 |
| 0.9215277777777778 | 0 |
| 0.9222222222222222 | 0 |
| 0.9229166666666666 | 0 |
| 0.9236111111111112 | 0 |
| 0.9243055555555556 | 0 |
| 0.9249999999999999 | 0 |
| 0.9256944444444444 | 0 |
| 0.9263888888888889 | 0 |
| 0.9270833333333334 | 0 |
| 0.9277777777777777 | 0 |
| 0.9284722222222223 | 0 |
| 0.9291666666666667 | 0 |
| 0.9298611111111111 | 0 |
| 0.9305555555555555 | 0 |
| 0.93125 | 0 |
| 0.9319444444444445 | 0 |
| 0.9326388888888889 | 0 |
| 0.9333333333333332 | 0 |
| 0.9340277777777778 | 0 |
| 0.9347222222222222 | 0 |
| 0.9354166666666667 | 0 |
| 0.936111111111111 | 0 |
| 0.9368055555555556 | 0 |
| 0.9375 | 0 |
| 0.9381944444444444 | 0 |
| 0.938888888888889 | 0 |
| 0.9395833333333333 | 0 |
| 0.9402777777777778 | 0 |
| 0.9409722222222222 | 0 |
| 0.9416666666666668 | 0 |
| 0.9423611111111111 | 0 |
| 0.9430555555555555 | 0 |
| 0.94375 | 0 |
| 0.9444444444444445 | 0 |
| 0.9451388888888889 | 0 |
| 0.9458333333333333 | 0 |
| 0.9465277777777777 | 0 |
| 0.9472222222222223 | 0 |
| 0.9479166666666666 | 0 |
| 0.9486111111111111 | 0 |
| 0.9493055555555556 | 0 |
| 0.9500000000000001 | 0 |
| 0.9506944444444444 | 0 |
| 0.9513888888888888 | 0 |
| 0.9520833333333334 | 0 |
| 0.9527777777777778 | 0 |
| 0.9534722222222222 | 0 |
| 0.9541666666666666 | 0 |
| 0.9548611111111112 | 0 |
| 0.9555555555555556 | 0 |
| 0.9562499999999999 | 0 |
| 0.9569444444444444 | 0 |
| 0.9576388888888889 | 0 |
| 0.9583333333333334 | 0 |
| 0.9590277777777777 | 0 |
| 0.9597222222222223 | 0 |
| 0.9604166666666667 | 0 |
| 0.9611111111111111 | 0 |
| 0.9618055555555555 | 0 |
| 0.9625 | 0 |
| 0.9631944444444445 | 0 |
| 0.9638888888888889 | 0 |
| 0.9645833333333332 | 0 |
| 0.9652777777777778 | 0 |
| 0.9659722222222222 | 0 |
| 0.9666666666666667 | 0 |
| 0.967361111111111 | 0 |
| 0.9680555555555556 | 0 |
| 0.96875 | 0 |
| 0.9694444444444444 | 0 |
| 0.970138888888889 | 0 |
| 0.9708333333333333 | 0 |
| 0.9715277777777778 | 0 |
| 0.9722222222222222 | 0 |
| 0.9729166666666668 | 0 |
| 0.9736111111111111 | 0 |
| 0.9743055555555555 | 0 |
| 0.975 | 0 |
| 0.9756944444444445 | 0 |
| 0.9763888888888889 | 0 |
| 0.9770833333333333 | 0 |
| 0.9777777777777777 | 0 |
| 0.9784722222222223 | 0 |
| 0.9791666666666666 | 0 |
| 0.9798611111111111 | 0 |
| 0.9805555555555556 | 0 |
| 0.9812500000000001 | 0 |
| 0.9819444444444444 | 0 |
| 0.9826388888888888 | 0 |
| 0.9833333333333334 | 0 |
| 0.9840277777777778 | 0 |
| 0.9847222222222222 | 0 |
| 0.9854166666666666 | 0 |
| 0.9861111111111112 | 0 |
| 0.9868055555555556 | 0 |
| 0.9874999999999999 | 0 |
| 0.9881944444444444 | 0 |
| 0.9888888888888889 | 0 |
| 0.9895833333333334 | 0 |
| 0.9902777777777777 | 0 |
| 0.9909722222222223 | 0 |
| 0.9916666666666667 | 0 |
| 0.9923611111111111 | 0 |
| 0.9930555555555555 | 0 |
| 0.99375 | 0 |
| 0.9944444444444445 | 0 |
| 0.9951388888888889 | 0 |
| 0.9958333333333332 | 0 |
| 0.9965277777777778 | 0 |
| 0.9972222222222222 | 0 |
| 0.9979166666666667 | 0 |
| 0.998611111111111 | 0 |
| 0.9993055555555556 | 0 |